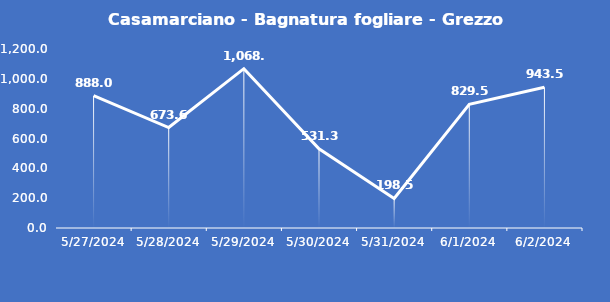
| Category | Casamarciano - Bagnatura fogliare - Grezzo (min) |
|---|---|
| 5/27/24 | 888 |
| 5/28/24 | 673.6 |
| 5/29/24 | 1068 |
| 5/30/24 | 531.3 |
| 5/31/24 | 198.5 |
| 6/1/24 | 829.5 |
| 6/2/24 | 943.5 |